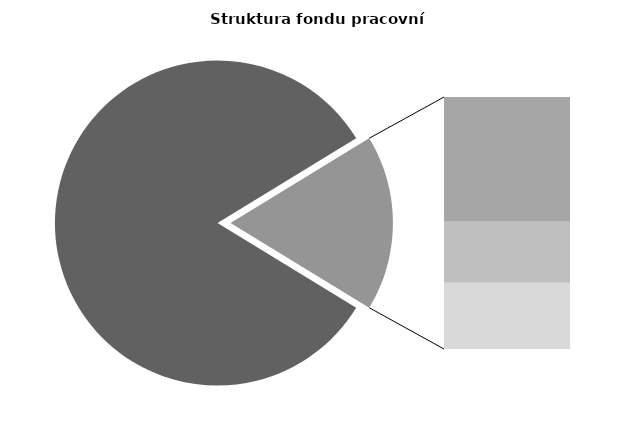
| Category | Series 0 |
|---|---|
| Průměrná měsíční odpracovaná doba bez přesčasu | 139.443 |
| Dovolená | 14.591 |
| Nemoc | 7.14 |
| Jiné | 7.756 |